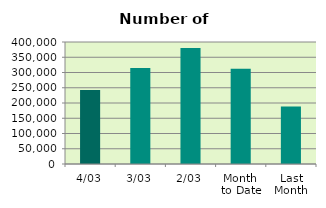
| Category | Series 0 |
|---|---|
| 4/03 | 242542 |
| 3/03 | 314820 |
| 2/03 | 380484 |
| Month 
to Date | 312615.333 |
| Last
Month | 188783.7 |